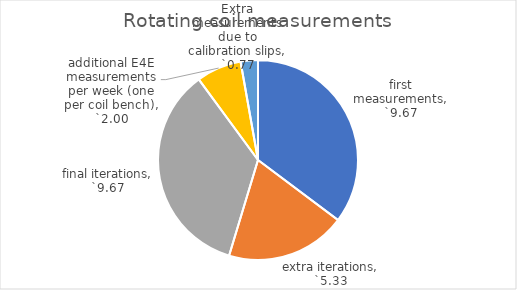
| Category | Rotating coil measurements |
|---|---|
| first measurements | 9.67 |
| extra iterations | 5.333 |
| final iterations | 9.67 |
| additional E4E measurements per week (one per coil bench) | 2 |
| Extra measurements due to calibration slips | 0.767 |